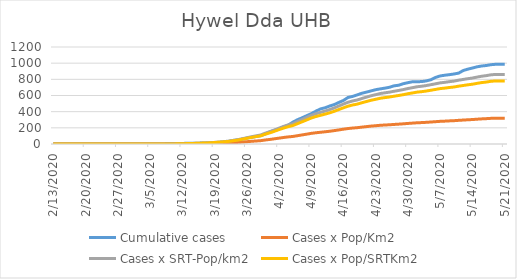
| Category | Cumulative cases | Cases x Pop/Km2 | Cases x SRT-Pop/km2 | Cases x Pop/SRTKm2 |
|---|---|---|---|---|
| 5/21/20 | 986 | 319.119 | 860.691 | 780.023 |
| 5/20/20 | 986 | 319.119 | 860.691 | 780.023 |
| 5/19/20 | 986 | 319.044 | 860.489 | 779.839 |
| 5/18/20 | 981 | 317.294 | 855.771 | 775.564 |
| 5/17/20 | 971 | 313.571 | 845.729 | 766.463 |
| 5/16/20 | 965 | 310.798 | 838.249 | 759.684 |
| 5/15/20 | 955 | 306.9 | 827.735 | 750.156 |
| 5/14/20 | 940 | 302.577 | 816.076 | 739.589 |
| 5/13/20 | 926 | 299.578 | 807.989 | 732.26 |
| 5/12/20 | 909 | 296.13 | 798.688 | 723.831 |
| 5/11/20 | 877 | 292.706 | 789.455 | 715.464 |
| 5/10/20 | 866 | 288.459 | 777.998 | 705.08 |
| 5/9/20 | 858 | 285.985 | 771.326 | 699.034 |
| 5/8/20 | 851 | 282.886 | 762.969 | 691.46 |
| 5/7/20 | 842 | 280.388 | 756.23 | 685.352 |
| 5/6/20 | 824 | 276.265 | 745.11 | 675.274 |
| 5/5/20 | 795 | 272.142 | 733.99 | 665.197 |
| 5/4/20 | 781 | 268.169 | 723.274 | 655.485 |
| 5/3/20 | 772 | 264.97 | 714.648 | 647.667 |
| 5/2/20 | 771 | 262.621 | 708.313 | 641.926 |
| 5/1/20 | 770 | 258.448 | 697.058 | 631.726 |
| 4/30/20 | 759 | 254.5 | 686.41 | 622.076 |
| 4/29/20 | 746 | 249.703 | 673.47 | 610.349 |
| 4/28/20 | 727 | 245.63 | 662.485 | 600.393 |
| 4/27/20 | 720 | 241.981 | 652.645 | 591.476 |
| 4/26/20 | 702 | 237.883 | 641.592 | 581.459 |
| 4/25/20 | 691 | 234.91 | 633.573 | 574.191 |
| 4/24/20 | 682 | 231.536 | 624.474 | 565.945 |
| 4/23/20 | 672 | 226.364 | 610.524 | 553.302 |
| 4/22/20 | 657 | 221.416 | 597.18 | 541.209 |
| 4/21/20 | 642 | 215.145 | 580.264 | 525.879 |
| 4/20/20 | 628 | 208.823 | 563.213 | 510.426 |
| 4/19/20 | 608 | 201.951 | 544.68 | 493.63 |
| 4/18/20 | 589 | 197.503 | 532.684 | 482.758 |
| 4/17/20 | 576 | 191.431 | 516.307 | 467.916 |
| 4/16/20 | 539 | 183.385 | 494.606 | 448.249 |
| 4/15/20 | 514 | 174.414 | 470.411 | 426.322 |
| 4/14/20 | 488 | 165.544 | 446.486 | 404.639 |
| 4/13/20 | 470 | 157.798 | 425.594 | 385.705 |
| 4/12/20 | 448 | 151.126 | 407.6 | 369.398 |
| 4/11/20 | 434 | 145.054 | 391.223 | 354.556 |
| 4/10/20 | 406 | 138.957 | 374.779 | 339.653 |
| 4/9/20 | 375 | 131.461 | 354.561 | 321.329 |
| 4/8/20 | 350 | 121.715 | 328.277 | 297.509 |
| 4/7/20 | 324 | 112.145 | 302.465 | 274.116 |
| 4/6/20 | 300 | 102.75 | 277.125 | 251.151 |
| 4/5/20 | 270 | 93.279 | 251.582 | 228.003 |
| 4/4/20 | 233 | 87.757 | 236.688 | 214.505 |
| 4/3/20 | 211 | 80.735 | 217.751 | 197.342 |
| 4/2/20 | 186 | 72.639 | 195.915 | 177.553 |
| 4/1/20 | 169 | 64.318 | 173.473 | 157.214 |
| 3/31/20 | 151 | 56.322 | 151.906 | 137.669 |
| 3/30/20 | 123 | 49.551 | 133.643 | 121.117 |
| 3/29/20 | 102 | 41.205 | 111.133 | 100.717 |
| 3/28/20 | 93 | 37.307 | 100.619 | 91.189 |
| 3/27/20 | 83 | 33.159 | 89.432 | 81.05 |
| 3/26/20 | 73 | 28.536 | 76.964 | 69.751 |
| 3/25/20 | 59 | 24.188 | 65.238 | 59.123 |
| 3/24/20 | 50 | 19.615 | 52.904 | 47.946 |
| 3/23/20 | 44 | 16.242 | 43.806 | 39.7 |
| 3/22/20 | 31 | 12.994 | 35.045 | 31.76 |
| 3/21/20 | 24 | 11.095 | 29.923 | 27.118 |
| 3/20/20 | 16 | 9.22 | 24.868 | 22.538 |
| 3/19/20 | 14 | 7.421 | 20.016 | 18.14 |
| 3/18/20 | 13 | 5.922 | 15.972 | 14.475 |
| 3/17/20 | 11 | 5.048 | 13.614 | 12.338 |
| 3/16/20 | 11 | 4.123 | 11.12 | 10.078 |
| 3/15/20 | 10 | 3.273 | 8.829 | 8.001 |
| 3/14/20 | 10 | 2.549 | 6.874 | 6.23 |
| 3/13/20 | 10 | 2.074 | 5.594 | 5.069 |
| 3/12/20 | 6 | 1.399 | 3.774 | 3.42 |
| 3/11/20 | 4 | 0.8 | 2.157 | 1.954 |
| 3/10/20 | 3 | 0.45 | 1.213 | 1.099 |
| 3/9/20 | 3 | 0.175 | 0.472 | 0.428 |
| 3/8/20 | 1 | 0.1 | 0.27 | 0.244 |
| 3/7/20 | 1 | 0.1 | 0.27 | 0.244 |
| 3/6/20 | 0 | 0.05 | 0.135 | 0.122 |
| 3/5/20 | 0 | 0.05 | 0.135 | 0.122 |
| 3/4/20 | 0 | 0.05 | 0.135 | 0.122 |
| 3/3/20 | 0 | 0.025 | 0.067 | 0.061 |
| 3/2/20 | 0 | 0.025 | 0.067 | 0.061 |
| 3/1/20 | 0 | 0.025 | 0.067 | 0.061 |
| 2/29/20 | 0 | 0.025 | 0.067 | 0.061 |
| 2/28/20 | 0 | 0.025 | 0.067 | 0.061 |
| 2/27/20 | 0 | 0.025 | 0.067 | 0.061 |
| 2/26/20 | 0 | 0 | 0 | 0 |
| 2/25/20 | 0 | 0 | 0 | 0 |
| 2/24/20 | 0 | 0 | 0 | 0 |
| 2/23/20 | 0 | 0 | 0 | 0 |
| 2/22/20 | 0 | 0 | 0 | 0 |
| 2/21/20 | 0 | 0 | 0 | 0 |
| 2/20/20 | 0 | 0 | 0 | 0 |
| 2/19/20 | 0 | 0 | 0 | 0 |
| 2/18/20 | 0 | 0 | 0 | 0 |
| 2/17/20 | 0 | 0 | 0 | 0 |
| 2/16/20 | 0 | 0 | 0 | 0 |
| 2/15/20 | 0 | 0 | 0 | 0 |
| 2/14/20 | 0 | 0 | 0 | 0 |
| 2/13/20 | 0 | 0 | 0 | 0 |